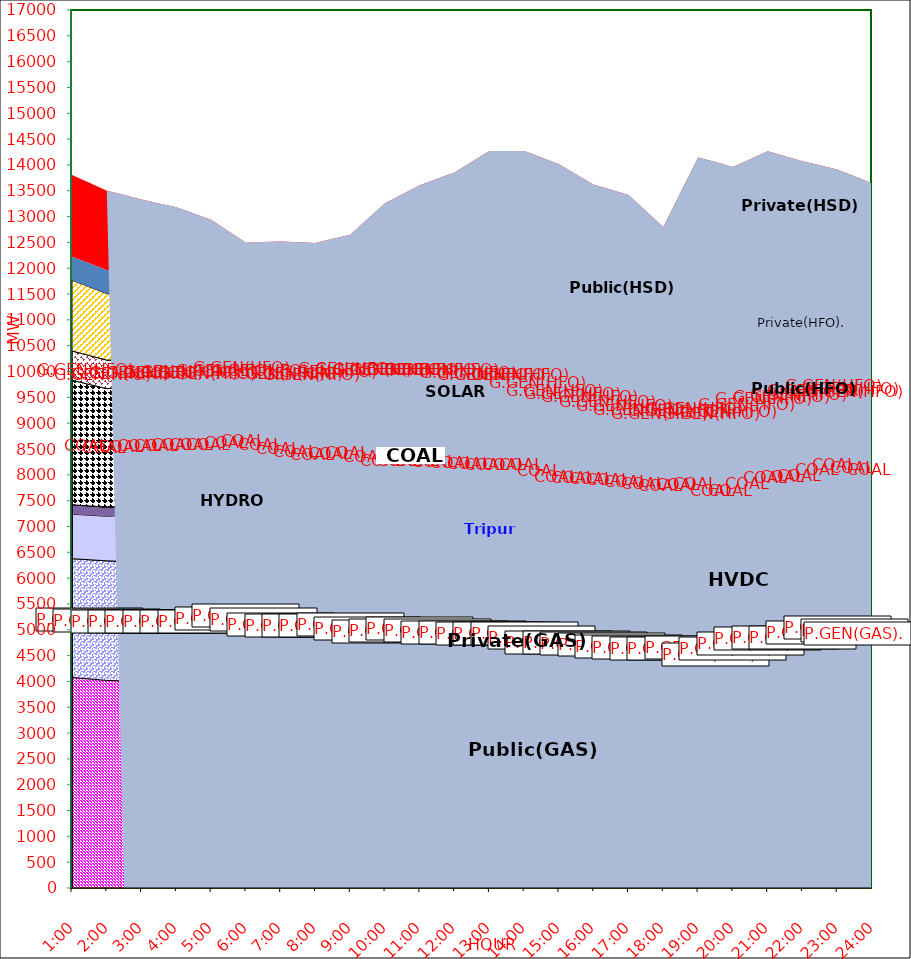
| Category | GAS | P.GEN(GAS). |  HVDC | TRIPURA | HYDRO | COAL | SOLAR | G.GEN(HFO) | P.GEN(HFO). | G.GEN(HSD) | P.GEN(HSD) | SHORTAGE | Total Energy Gen 295.776 MKWHr 
Energy Not Served   27.534 MKWHr 
Energy Requirement     323.310 MKWHr  |
|---|---|---|---|---|---|---|---|---|---|---|---|---|---|
| 1:00 | 4076 | 2300 | 862 | 182 | 0 | 2412 | 0 | 566 | 1370 | 0 | 456 | 1582.435 |  |
| 1:30 | 4048 | 2307.5 | 862.5 | 179 | 0 | 2353 | 0 | 559.5 | 1329 | 0 | 456 | 1559.515 |  |
| 2:00 | 4020 | 2315 | 863 | 176 | 0 | 2294 | 0 | 553 | 1288 | 0 | 456 | 1536.595 |  |
| 2:30 | 4008 | 2314 | 891 | 175 | 0 | 2306 | 0 | 529.5 | 1244.5 | 0 | 456.5 | 1491.233 |  |
| 3:00 | 3996 | 2313 | 919 | 174 | 0 | 2318 | 0 | 506 | 1201 | 0 | 457 | 1445.87 |  |
| 3:30 | 3998 | 2318 | 919.5 | 173 | 0 | 2322 | 0 | 504.5 | 1197 | 0 | 436.5 | 1386.182 |  |
| 4:00 | 4000 | 2323 | 920 | 172 | 0 | 2326 | 0 | 503 | 1193 | 0 | 416 | 1326.495 |  |
| 4:30 | 4004 | 2322.5 | 920 | 171 | 0 | 2327.5 | 0 | 469.5 | 1176.5 | 0 | 386 | 1281.132 |  |
| 5:00 | 4008 | 2322 | 920 | 170 | 0 | 2329 | 0 | 436 | 1160 | 0 | 356 | 1235.77 |  |
| 5:30 | 4066.5 | 2317.5 | 920 | 165 | 0 | 2320 | 10 | 438.5 | 1133 | 0 | 178 | 1167.487 |  |
| 6:00 | 4125 | 2313 | 920 | 160 | 0 | 2311 | 20 | 441 | 1106 | 0 | 0 | 1099.205 |  |
| 6:30 | 4035 | 2313 | 920 | 158 | 0 | 2324 | 53 | 435 | 1144 | 0 | 0 | 1124.99 |  |
| 7:00 | 3945 | 2313 | 920 | 156 | 0 | 2337 | 86 | 429 | 1182 | 0 | 0 | 1150.775 |  |
| 7:30 | 3965 | 2250 | 920 | 156 | 0 | 2317 | 140.5 | 420 | 1247 | 0 | 0 | 1088.7 |  |
| 8:00 | 3985 | 2187 | 920 | 156 | 0 | 2297 | 195 | 411 | 1312 | 0 | 0 | 1026.625 |  |
| 8:30 | 3999.5 | 2183 | 920.5 | 153 | 0 | 2308.5 | 235.5 | 400.5 | 1326.5 | 0 | 0 | 1042.86 |  |
| 9:00 | 4014 | 2179 | 921 | 150 | 0 | 2320 | 276 | 390 | 1341 | 0 | 0 | 1059.095 |  |
| 9:30 | 3963 | 2138.5 | 918.5 | 154 | 9 | 2342 | 325.5 | 394.5 | 1539 | 0 | 180.5 | 988.902 |  |
| 10:00 | 3912 | 2098 | 916 | 158 | 18 | 2364 | 375 | 399 | 1737 | 0 | 361 | 918.71 |  |
| 10:30 | 3947.5 | 2085 | 916.5 | 159 | 21.5 | 2309.5 | 398 | 412 | 1881.5 | 0 | 405 | 897.222 |  |
| 11:00 | 3983 | 2072 | 917 | 160 | 25 | 2255 | 421 | 425 | 2026 | 0 | 449 | 875.735 |  |
| 11:30 | 3962.5 | 2050.5 | 917 | 158 | 25 | 2288.5 | 425 | 423 | 2082.5 | 0 | 452.5 | 945.928 |  |
| 12:00 | 3942 | 2029 | 917 | 156 | 25 | 2322 | 429 | 421 | 2139 | 0 | 456 | 1016.12 |  |
| 12:30 | 3935 | 2022.5 | 915.5 | 159 | 25 | 2316 | 400.5 | 427 | 2182 | 0 | 453.5 | 1226.22 |  |
| 13:00 | 3928 | 2016 | 914 | 162 | 25 | 2310 | 372 | 433 | 2225 | 0 | 451 | 1436.32 |  |
| 13:30 | 3928 | 2016 | 914 | 162 | 25 | 2310 | 372 | 433 | 2225 | 0 | 451 | 1436.32 |  |
| 14:00 | 3928 | 2016 | 914 | 162 | 25 | 2310 | 372 | 433 | 2225 | 0 | 451 | 1436.32 |  |
| 14:30 | 3853 | 1980.5 | 914.5 | 160 | 25 | 2310.5 | 313 | 464 | 2020.5 | 12.5 | 450.5 | 1638.78 |  |
| 15:00 | 3778 | 1945 | 915 | 158 | 25 | 2311 | 254 | 495 | 1816 | 25 | 450 | 1841.24 |  |
| 15:30 | 3772.5 | 1946.5 | 914.5 | 145 | 25 | 2304 | 213 | 499.5 | 1808.5 | 52.5 | 322 | 1811.635 |  |
| 16:00 | 3767 | 1948 | 914 | 132 | 25 | 2297 | 172 | 504 | 1801 | 80 | 194 | 1782.03 |  |
| 16:30 | 3730.5 | 1955 | 914 | 132 | 25 | 2291 | 125 | 511.5 | 1827 | 100 | 168 | 1739.055 |  |
| 17:00 | 3694 | 1962 | 914 | 132 | 25 | 2285 | 78 | 519 | 1853 | 120 | 142 | 1696.08 |  |
| 17:30 | 3673.5 | 1956.5 | 914 | 134 | 25 | 2250.5 | 47 | 544.5 | 2004 | 60 | 96 | 1404.04 |  |
| 18:00 | 3653 | 1951 | 914 | 136 | 25 | 2216 | 16 | 570 | 2155 | 0 | 50 | 1112 |  |
| 18:30 | 3653 | 1985 | 914 | 137 | 25 | 2200.5 | 8 | 630 | 2608.5 | 0 | 154.5 | 1155.262 |  |
| 19:00 | 3653 | 2019 | 914 | 138 | 25 | 2185 | 0 | 690 | 3062 | 0 | 259 | 1198.525 |  |
| 19:30 | 3576 | 1908 | 914 | 132 | 25 | 2275 | 0 | 714 | 3288 | 0 | 206 | 1019.94 |  |
| 20:00 | 3677 | 1910 | 804 | 128 | 25 | 2303 | 0 | 755 | 3348 | 0 | 169 | 841.355 |  |
| 20:30 | 3747 | 1966 | 804 | 134 | 25 | 2296 | 0 | 761.5 | 3265 | 0 | 311.5 | 802.2 |  |
| 21:00 | 3817 | 2022 | 804 | 140 | 25 | 2289 | 0 | 768 | 3182 | 0 | 454 | 763.045 |  |
| 21:30 | 3836 | 2012 | 804 | 140 | 25 | 2315 | 0 | 768 | 3106.5 | 0 | 453.5 | 706.7 |  |
| 22:00 | 3855 | 2002 | 804 | 140 | 25 | 2341 | 0 | 768 | 3031 | 0 | 453 | 650.355 |  |
| 22:30 | 3944.5 | 2016 | 803.5 | 144 | 12.5 | 2349 | 0 | 743 | 2820 | 0 | 453 | 706.222 |  |
| 23:00 | 4034 | 2030 | 803 | 148 | 0 | 2357 | 0 | 718 | 2609 | 0 | 453 | 762.09 |  |
| 23:30 | 3972.5 | 2026.5 | 803.5 | 148 | 0 | 2386 | 0 | 677.5 | 2337 | 0 | 455 | 973.145 |  |
| 24:00 | 3911 | 2023 | 804 | 148 | 0 | 2415 | 0 | 637 | 2065 | 0 | 457 | 1184.2 |  |